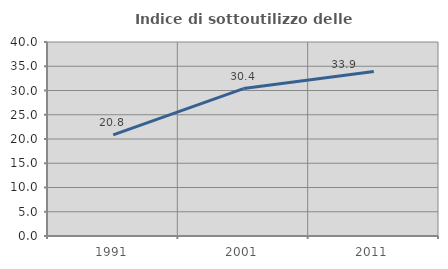
| Category | Indice di sottoutilizzo delle abitazioni  |
|---|---|
| 1991.0 | 20.849 |
| 2001.0 | 30.397 |
| 2011.0 | 33.896 |